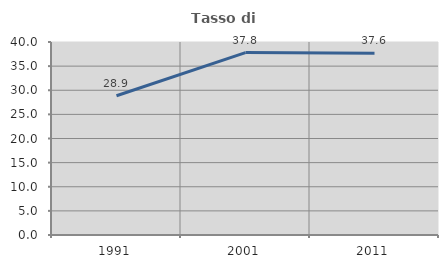
| Category | Tasso di occupazione   |
|---|---|
| 1991.0 | 28.852 |
| 2001.0 | 37.807 |
| 2011.0 | 37.644 |